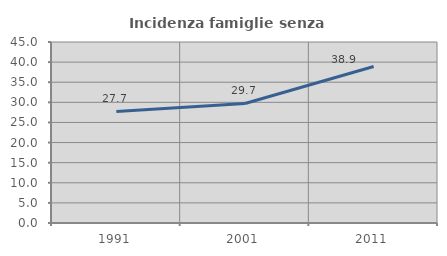
| Category | Incidenza famiglie senza nuclei |
|---|---|
| 1991.0 | 27.745 |
| 2001.0 | 29.713 |
| 2011.0 | 38.912 |